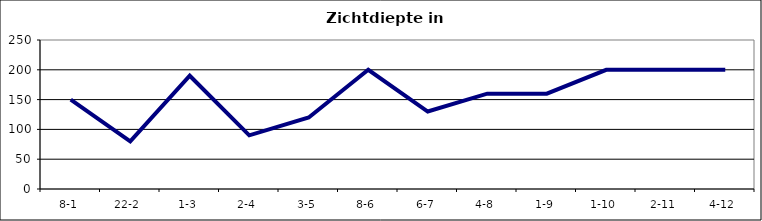
| Category | Zichtdiepte in cm |
|---|---|
| 8-1 | 150 |
| 22-2 | 80 |
| 1-3 | 190 |
| 2-4 | 90 |
| 3-5 | 120 |
| 8-6 | 200 |
| 6-7 | 130 |
| 4-8 | 160 |
| 1-9 | 160 |
| 1-10 | 200 |
| 2-11 | 200 |
| 4-12 | 200 |